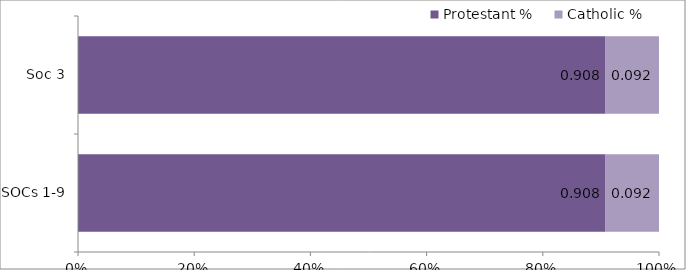
| Category | Protestant | Catholic |
|---|---|---|
| SOCs 1-9 | 0.908 | 0.092 |
| Soc 3 | 0.908 | 0.092 |